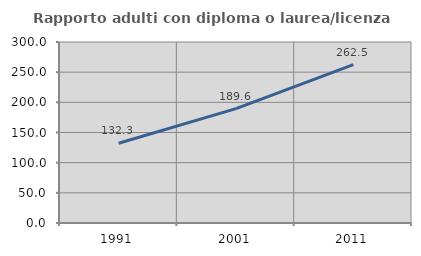
| Category | Rapporto adulti con diploma o laurea/licenza media  |
|---|---|
| 1991.0 | 132.273 |
| 2001.0 | 189.603 |
| 2011.0 | 262.517 |